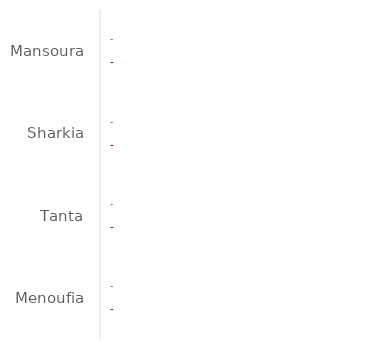
| Category | Sales | Sales LY |
|---|---|---|
| Mansoura | 497479.533 | 339607.83 |
| Sharkia | 492879.765 | 236251.33 |
| Tanta | 35155.435 | 464082.6 |
| Menoufia | 336943.133 | 198214.54 |